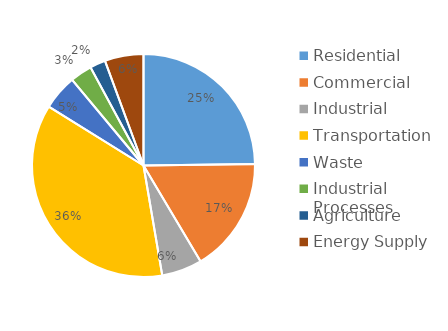
| Category | Series 0 |
|---|---|
| Residential | 4421512.99 |
| Commercial | 2968490.964 |
| Industrial | 1043685.484 |
| Transportation | 6511928.11 |
| Waste | 910882.246 |
| Industrial Processes | 566023.747 |
| Agriculture | 403143.96 |
| Energy Supply | 1000960.993 |